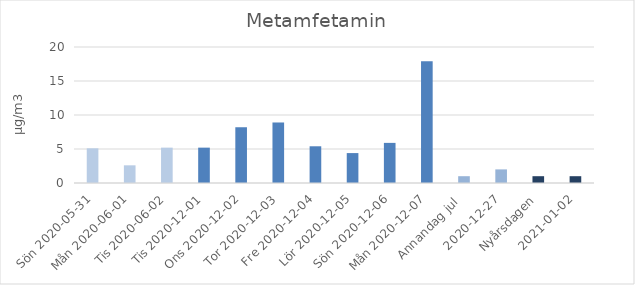
| Category | Metamfetamin |
|---|---|
| Sön 2020-05-31 | 5.1 |
| Mån 2020-06-01 | 2.6 |
|  Tis 2020-06-02 | 5.2 |
| Tis 2020-12-01 | 5.2 |
| Ons 2020-12-02 | 8.2 |
| Tor 2020-12-03 | 8.9 |
| Fre 2020-12-04 | 5.4 |
| Lör 2020-12-05 | 4.4 |
| Sön 2020-12-06 | 5.9 |
| Mån 2020-12-07 | 17.9 |
| Annandag jul  | 1 |
| 2020-12-27 | 2 |
| Nyårsdagen | 1 |
| 2021-01-02 | 1 |